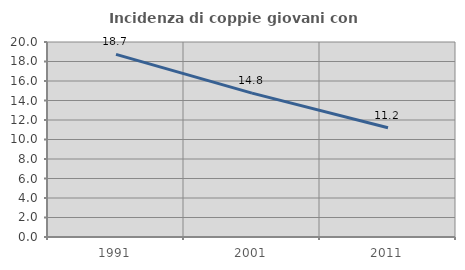
| Category | Incidenza di coppie giovani con figli |
|---|---|
| 1991.0 | 18.736 |
| 2001.0 | 14.752 |
| 2011.0 | 11.201 |